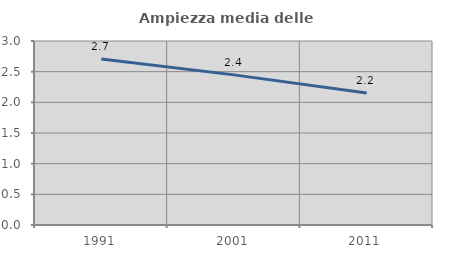
| Category | Ampiezza media delle famiglie |
|---|---|
| 1991.0 | 2.705 |
| 2001.0 | 2.448 |
| 2011.0 | 2.152 |